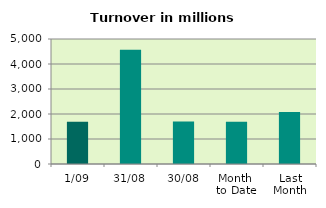
| Category | Series 0 |
|---|---|
| 1/09 | 1690.766 |
| 31/08 | 4568.233 |
| 30/08 | 1704.596 |
| Month 
to Date | 1690.766 |
| Last
Month | 2079.707 |